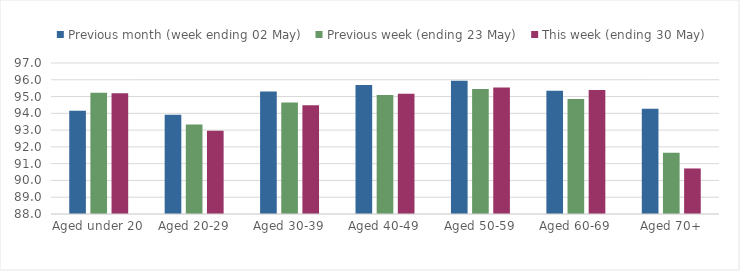
| Category | Previous month (week ending 02 May) | Previous week (ending 23 May) | This week (ending 30 May) |
|---|---|---|---|
| Aged under 20 | 94.159 | 95.232 | 95.198 |
| Aged 20-29 | 93.909 | 93.337 | 92.958 |
| Aged 30-39 | 95.301 | 94.641 | 94.481 |
| Aged 40-49 | 95.685 | 95.098 | 95.165 |
| Aged 50-59 | 95.943 | 95.445 | 95.547 |
| Aged 60-69 | 95.345 | 94.851 | 95.392 |
| Aged 70+ | 94.267 | 91.652 | 90.715 |